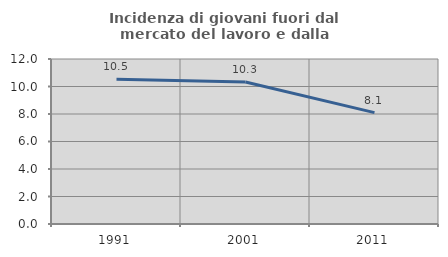
| Category | Incidenza di giovani fuori dal mercato del lavoro e dalla formazione  |
|---|---|
| 1991.0 | 10.526 |
| 2001.0 | 10.326 |
| 2011.0 | 8.099 |